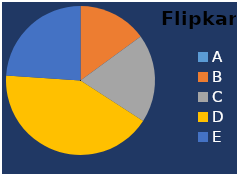
| Category | Flipkart |
|---|---|
| A | 0 |
| B | 250 |
| C | 320 |
| D | 700 |
| E | 400 |